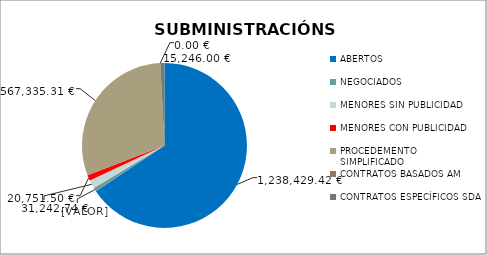
| Category | Series 0 |
|---|---|
| ABERTOS  | 1238429.42 |
| NEGOCIADOS  | 14000 |
| MENORES SIN PUBLICIDAD | 31242.74 |
| MENORES CON PUBLICIDAD | 20751.5 |
| PROCEDEMENTO SIMPLIFICADO | 567335.31 |
| CONTRATOS BASADOS AM | 0 |
| CONTRATOS ESPECÍFICOS SDA | 15246 |